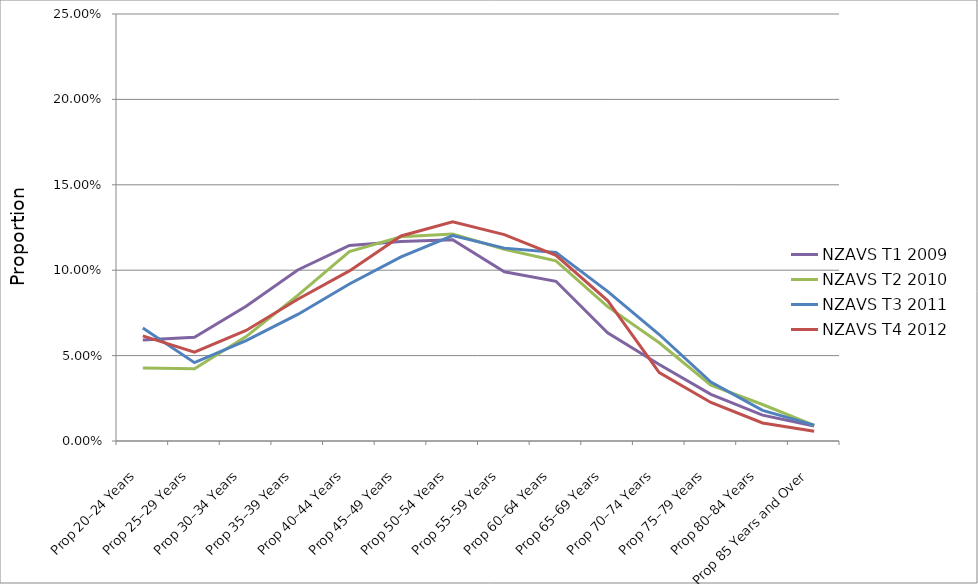
| Category | NZAVS T1 2009 | NZAVS T2 2010 | NZAVS T3 2011 | NZAVS T4 2012 |
|---|---|---|---|---|
| Prop 20–24 Years | 0.059 | 0.043 | 0.066 | 0.062 |
| Prop 25–29 Years | 0.061 | 0.042 | 0.046 | 0.052 |
| Prop 30–34 Years | 0.079 | 0.061 | 0.059 | 0.065 |
| Prop 35–39 Years | 0.1 | 0.085 | 0.074 | 0.083 |
| Prop 40–44 Years | 0.114 | 0.111 | 0.092 | 0.1 |
| Prop 45–49 Years | 0.117 | 0.12 | 0.108 | 0.12 |
| Prop 50–54 Years | 0.118 | 0.121 | 0.12 | 0.128 |
| Prop 55–59 Years | 0.099 | 0.112 | 0.113 | 0.121 |
| Prop 60–64 Years | 0.094 | 0.105 | 0.11 | 0.109 |
| Prop 65–69 Years | 0.063 | 0.079 | 0.088 | 0.082 |
| Prop 70–74 Years | 0.045 | 0.058 | 0.062 | 0.04 |
| Prop 75–79 Years | 0.027 | 0.033 | 0.035 | 0.023 |
| Prop 80–84 Years | 0.015 | 0.021 | 0.018 | 0.011 |
| Prop 85 Years and Over | 0.009 | 0.009 | 0.009 | 0.006 |